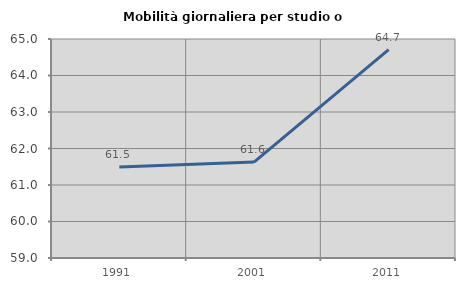
| Category | Mobilità giornaliera per studio o lavoro |
|---|---|
| 1991.0 | 61.496 |
| 2001.0 | 61.629 |
| 2011.0 | 64.709 |